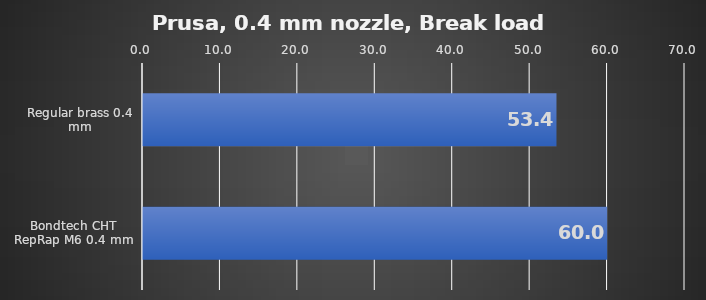
| Category | Average |
|---|---|
| Regular brass 0.4 mm | 53.4 |
| Bondtech CHT RepRap M6 0.4 mm | 59.95 |